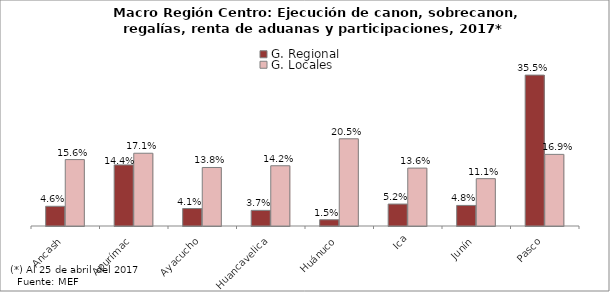
| Category | G. Regional | G. Locales |
|---|---|---|
| Ancash | 0.046 | 0.156 |
| Apurímac | 0.144 | 0.171 |
| Ayacucho | 0.041 | 0.138 |
| Huancavelica | 0.037 | 0.142 |
| Huánuco | 0.015 | 0.205 |
| Ica | 0.052 | 0.136 |
| Junín | 0.048 | 0.111 |
| Pasco | 0.355 | 0.169 |